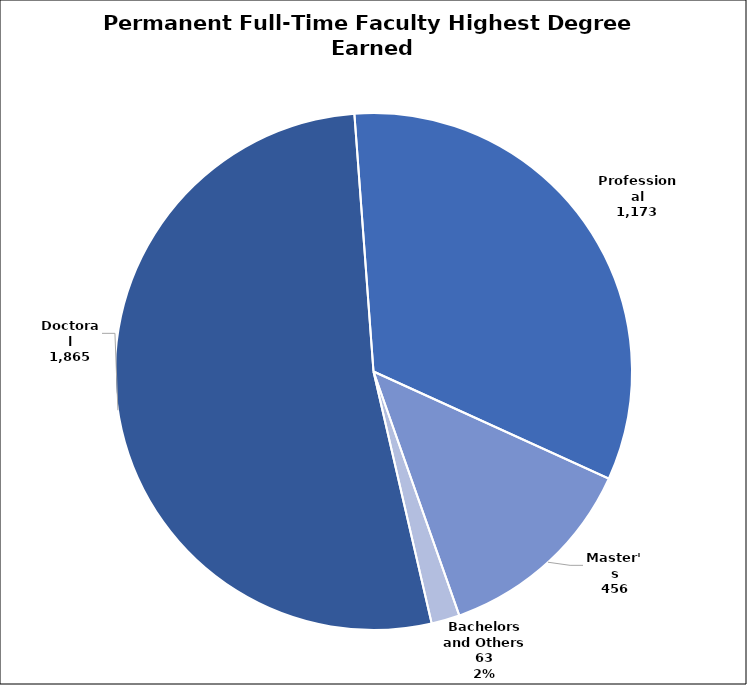
| Category | Count |
|---|---|
| Doctoral | 1865 |
| Professional | 1173 |
| Master's | 456 |
| Bachelors and Others | 63 |